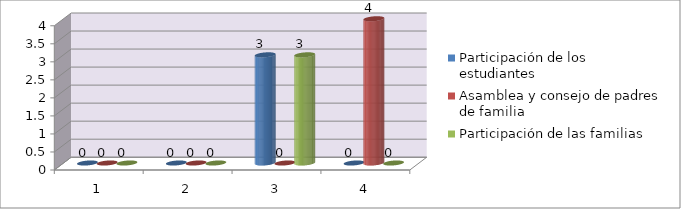
| Category | Participación de los
estudiantes | Asamblea y consejo de padres de familia | Participación de las familias |
|---|---|---|---|
| 0 | 0 | 0 | 0 |
| 1 | 0 | 0 | 0 |
| 2 | 3 | 0 | 3 |
| 3 | 0 | 4 | 0 |